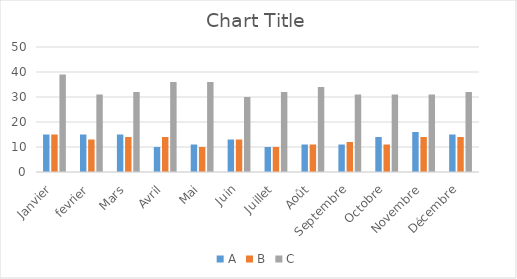
| Category | A | B | C |
|---|---|---|---|
| Janvier | 15 | 15 | 39 |
| fevrier | 15 | 13 | 31 |
| Mars | 15 | 14 | 32 |
| Avril | 10 | 14 | 36 |
| Mai | 11 | 10 | 36 |
| Juin | 13 | 13 | 30 |
| Juillet | 10 | 10 | 32 |
| Août | 11 | 11 | 34 |
| Septembre | 11 | 12 | 31 |
| Octobre | 14 | 11 | 31 |
| Novembre | 16 | 14 | 31 |
| Décembre | 15 | 14 | 32 |